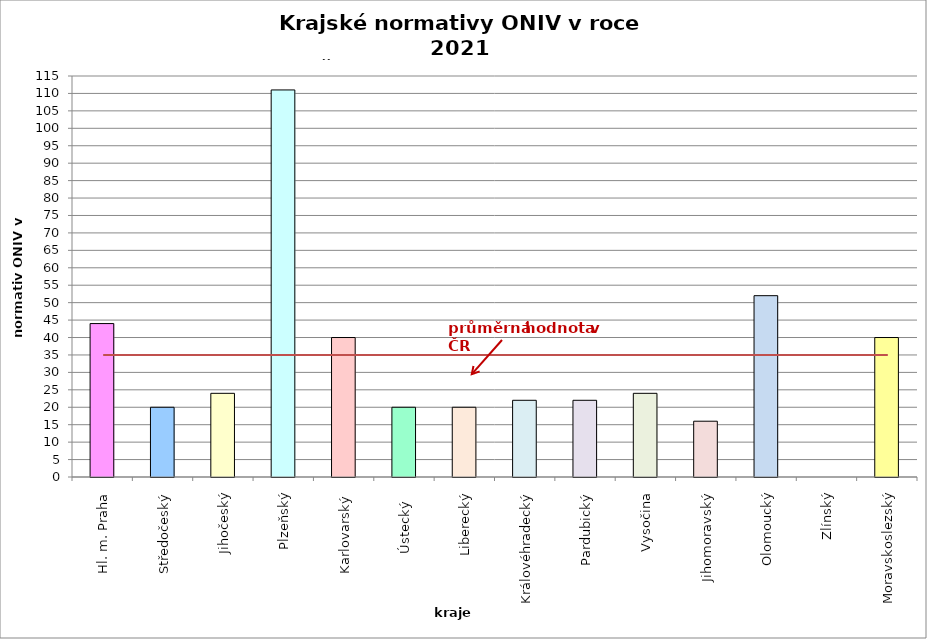
| Category | Series 0 |
|---|---|
| Hl. m. Praha | 44 |
| Středočeský | 20 |
| Jihočeský | 24 |
| Plzeňský | 111 |
| Karlovarský  | 40 |
| Ústecký   | 20 |
| Liberecký | 20 |
| Královéhradecký | 22 |
| Pardubický | 22 |
| Vysočina | 24 |
| Jihomoravský | 16 |
| Olomoucký | 52 |
| Zlínský | 0 |
| Moravskoslezský | 40 |